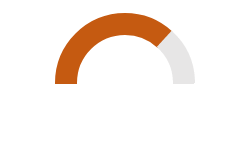
| Category | Series 0 |
|---|---|
| 0 | 0.368 |
| 1 | 0.132 |
| 2 | 0.5 |